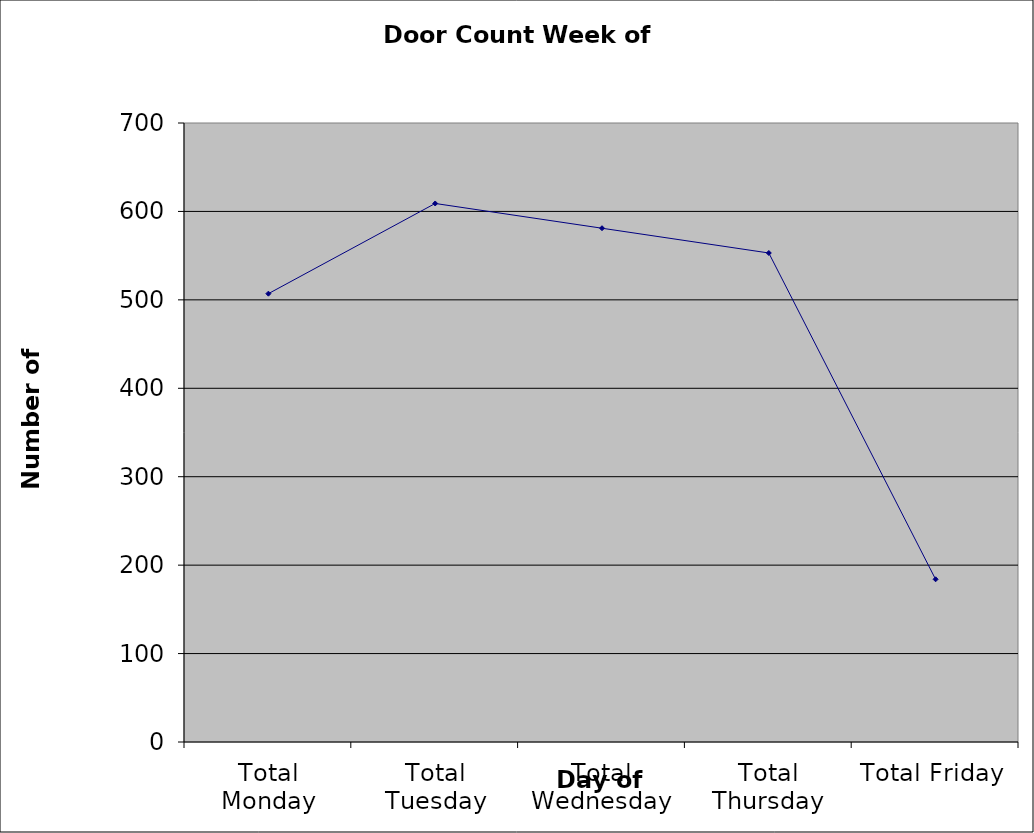
| Category | Series 0 |
|---|---|
| Total Monday | 507 |
| Total Tuesday | 609 |
| Total Wednesday | 581 |
| Total Thursday | 553 |
| Total Friday | 184 |